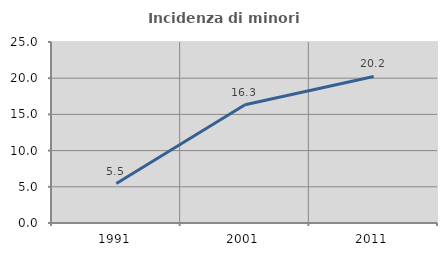
| Category | Incidenza di minori stranieri |
|---|---|
| 1991.0 | 5.455 |
| 2001.0 | 16.327 |
| 2011.0 | 20.245 |